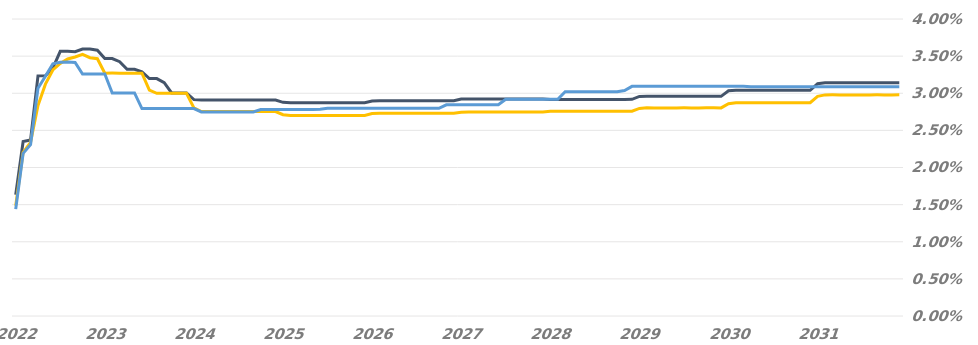
| Category | Resets |
|---|---|
| 2022-06-27 | 0.014 |
| 2022-07-27 | 0.022 |
| 2022-08-27 | 0.023 |
| 2022-09-27 | 0.031 |
| 2022-10-27 | 0.032 |
| 2022-11-27 | 0.034 |
| 2022-12-27 | 0.034 |
| 2023-01-27 | 0.034 |
| 2023-02-27 | 0.034 |
| 2023-03-27 | 0.033 |
| 2023-04-27 | 0.033 |
| 2023-05-27 | 0.033 |
| 2023-06-27 | 0.033 |
| 2023-07-27 | 0.03 |
| 2023-08-27 | 0.03 |
| 2023-09-27 | 0.03 |
| 2023-10-27 | 0.03 |
| 2023-11-27 | 0.028 |
| 2023-12-27 | 0.028 |
| 2024-01-27 | 0.028 |
| 2024-02-27 | 0.028 |
| 2024-03-27 | 0.028 |
| 2024-04-27 | 0.028 |
| 2024-05-27 | 0.028 |
| 2024-06-27 | 0.028 |
| 2024-07-27 | 0.027 |
| 2024-08-27 | 0.027 |
| 2024-09-27 | 0.027 |
| 2024-10-27 | 0.027 |
| 2024-11-27 | 0.027 |
| 2024-12-27 | 0.027 |
| 2025-01-27 | 0.027 |
| 2025-02-27 | 0.027 |
| 2025-03-27 | 0.028 |
| 2025-04-27 | 0.028 |
| 2025-05-27 | 0.028 |
| 2025-06-27 | 0.028 |
| 2025-07-27 | 0.028 |
| 2025-08-27 | 0.028 |
| 2025-09-27 | 0.028 |
| 2025-10-27 | 0.028 |
| 2025-11-27 | 0.028 |
| 2025-12-27 | 0.028 |
| 2026-01-27 | 0.028 |
| 2026-02-27 | 0.028 |
| 2026-03-27 | 0.028 |
| 2026-04-27 | 0.028 |
| 2026-05-27 | 0.028 |
| 2026-06-27 | 0.028 |
| 2026-07-27 | 0.028 |
| 2026-08-27 | 0.028 |
| 2026-09-27 | 0.028 |
| 2026-10-27 | 0.028 |
| 2026-11-27 | 0.028 |
| 2026-12-27 | 0.028 |
| 2027-01-27 | 0.028 |
| 2027-02-27 | 0.028 |
| 2027-03-27 | 0.028 |
| 2027-04-27 | 0.028 |
| 2027-05-27 | 0.028 |
| 2027-06-27 | 0.028 |
| 2027-07-27 | 0.028 |
| 2027-08-27 | 0.028 |
| 2027-09-27 | 0.028 |
| 2027-10-27 | 0.028 |
| 2027-11-27 | 0.028 |
| 2027-12-27 | 0.029 |
| 2028-01-27 | 0.029 |
| 2028-02-27 | 0.029 |
| 2028-03-27 | 0.029 |
| 2028-04-27 | 0.029 |
| 2028-05-27 | 0.029 |
| 2028-06-27 | 0.029 |
| 2028-07-27 | 0.029 |
| 2028-08-27 | 0.03 |
| 2028-09-27 | 0.03 |
| 2028-10-27 | 0.03 |
| 2028-11-27 | 0.03 |
| 2028-12-27 | 0.03 |
| 2029-01-27 | 0.03 |
| 2029-02-27 | 0.03 |
| 2029-03-27 | 0.03 |
| 2029-04-27 | 0.03 |
| 2029-05-27 | 0.031 |
| 2029-06-27 | 0.031 |
| 2029-07-27 | 0.031 |
| 2029-08-27 | 0.031 |
| 2029-09-27 | 0.031 |
| 2029-10-27 | 0.031 |
| 2029-11-27 | 0.031 |
| 2029-12-27 | 0.031 |
| 2030-01-27 | 0.031 |
| 2030-02-27 | 0.031 |
| 2030-03-27 | 0.031 |
| 2030-04-27 | 0.031 |
| 2030-05-27 | 0.031 |
| 2030-06-27 | 0.031 |
| 2030-07-27 | 0.031 |
| 2030-08-27 | 0.031 |
| 2030-09-27 | 0.031 |
| 2030-10-27 | 0.031 |
| 2030-11-27 | 0.031 |
| 2030-12-27 | 0.031 |
| 2031-01-27 | 0.031 |
| 2031-02-27 | 0.031 |
| 2031-03-27 | 0.031 |
| 2031-04-27 | 0.031 |
| 2031-05-27 | 0.031 |
| 2031-06-27 | 0.031 |
| 2031-07-27 | 0.031 |
| 2031-08-27 | 0.031 |
| 2031-09-27 | 0.031 |
| 2031-10-27 | 0.031 |
| 2031-11-27 | 0.031 |
| 2031-12-27 | 0.031 |
| 2032-01-27 | 0.031 |
| 2032-02-27 | 0.031 |
| 2032-03-27 | 0.031 |
| 2032-04-27 | 0.031 |
| 2032-05-27 | 0.031 |